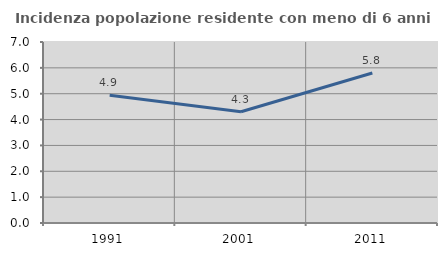
| Category | Incidenza popolazione residente con meno di 6 anni |
|---|---|
| 1991.0 | 4.941 |
| 2001.0 | 4.303 |
| 2011.0 | 5.803 |